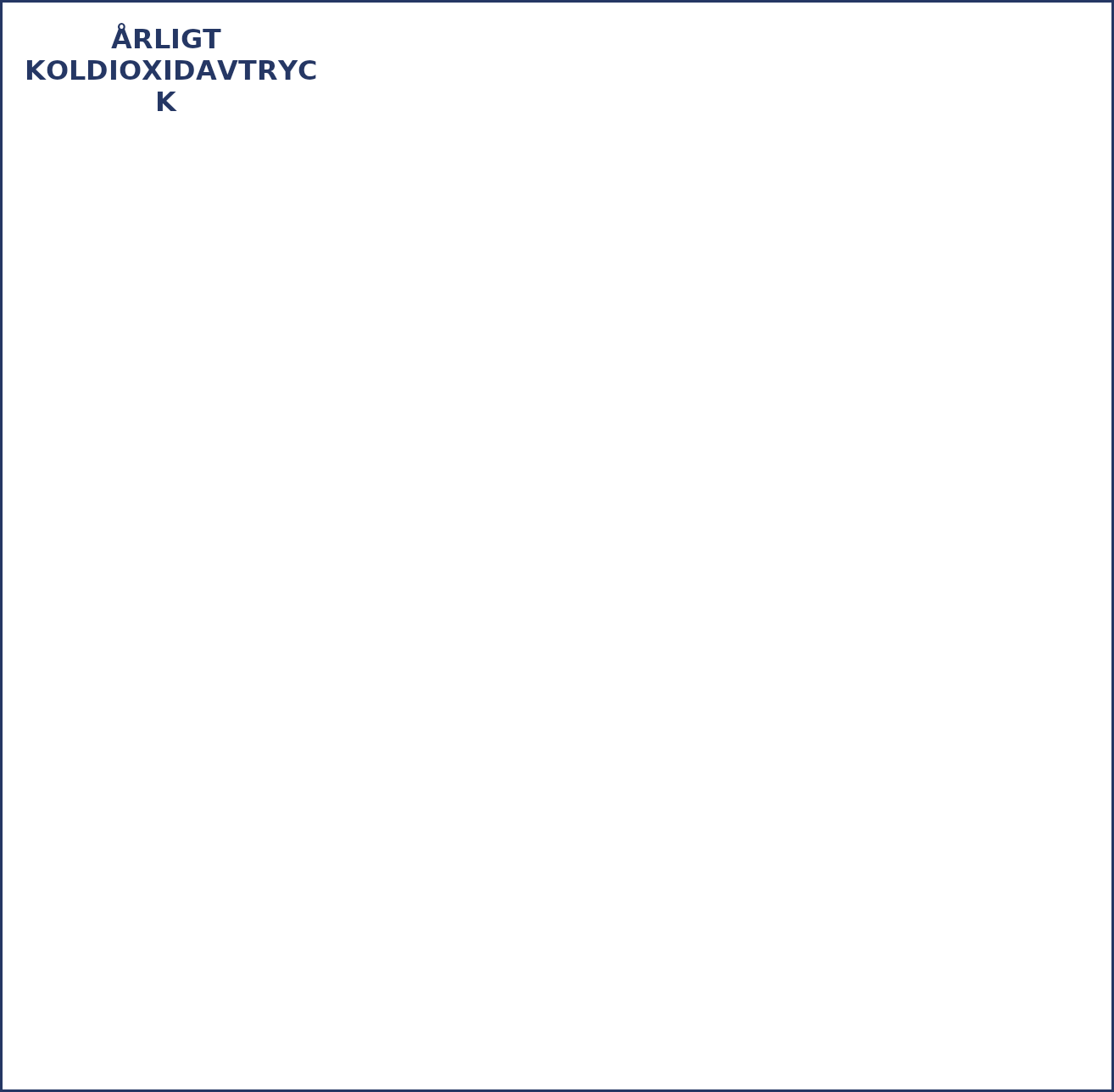
| Category | Series 0 | Series 1 |
|---|---|---|
| Regelbunden verksamhet/Veckoverksamhet | 0 |  |
| Sopsortering | 0 |  |
| Anskaffningar | 0 |  |
| Tjänster | 0 |  |
| Förbränning | 0 |  |
| Evenemang | 0 |  |
| Postning | 0 |  |
| Energi | 0 |  |
| Flygresor, inkvartering och andra resor | 0 |  |
| Tjänsteresor för anställd personal  | 0 |  |
| Organisationens fordon  | 0 |  |